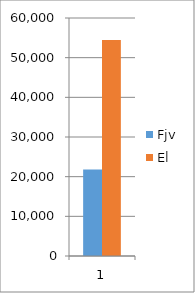
| Category | Fjv | El |
|---|---|---|
| 0 | 21823.125 | 54480 |